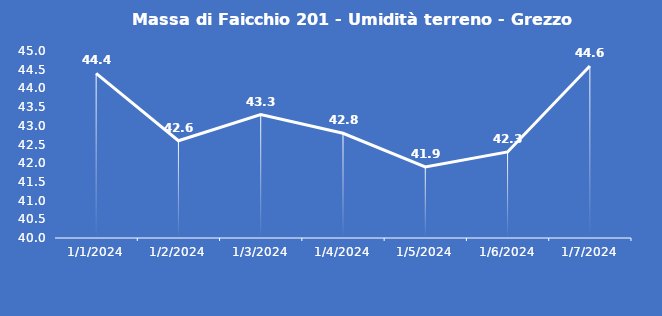
| Category | Massa di Faicchio 201 - Umidità terreno - Grezzo (%VWC) |
|---|---|
| 1/1/24 | 44.4 |
| 1/2/24 | 42.6 |
| 1/3/24 | 43.3 |
| 1/4/24 | 42.8 |
| 1/5/24 | 41.9 |
| 1/6/24 | 42.3 |
| 1/7/24 | 44.6 |